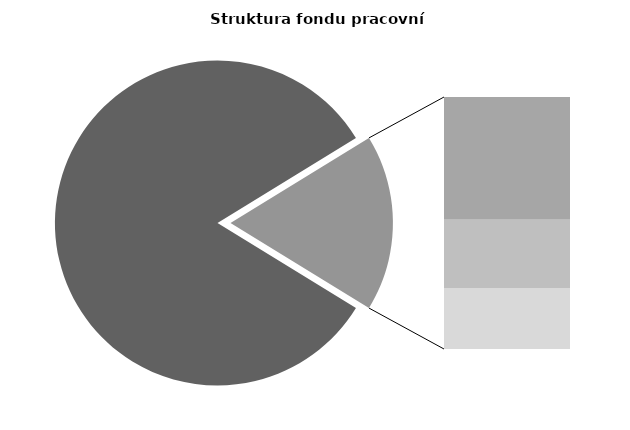
| Category | Series 0 |
|---|---|
| Průměrná měsíční odpracovaná doba bez přesčasu | 139.745 |
| Dovolená | 14.474 |
| Nemoc | 8.059 |
| Jiné | 7.187 |